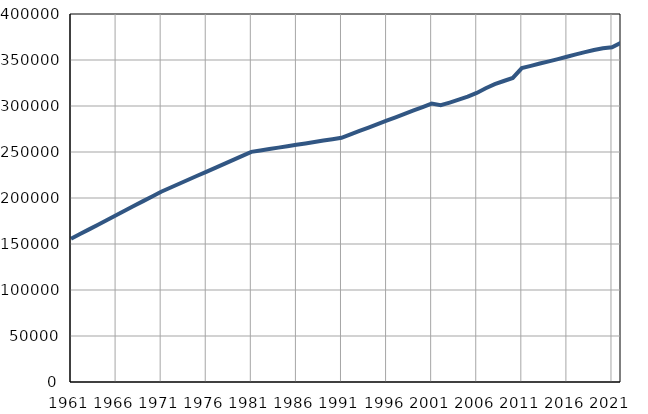
| Category | Population
size |
|---|---|
| 1961.0 | 155685 |
| 1962.0 | 160799 |
| 1963.0 | 165912 |
| 1964.0 | 171026 |
| 1965.0 | 176139 |
| 1966.0 | 181252 |
| 1967.0 | 186367 |
| 1968.0 | 191480 |
| 1969.0 | 196594 |
| 1970.0 | 201708 |
| 1971.0 | 206821 |
| 1972.0 | 211153 |
| 1973.0 | 215484 |
| 1974.0 | 219816 |
| 1975.0 | 224147 |
| 1976.0 | 228480 |
| 1977.0 | 232811 |
| 1978.0 | 237143 |
| 1979.0 | 241475 |
| 1980.0 | 245806 |
| 1981.0 | 250138 |
| 1982.0 | 251671 |
| 1983.0 | 253204 |
| 1984.0 | 254736 |
| 1985.0 | 256268 |
| 1986.0 | 257801 |
| 1987.0 | 259334 |
| 1988.0 | 260866 |
| 1989.0 | 262399 |
| 1990.0 | 263931 |
| 1991.0 | 265464 |
| 1992.0 | 269177 |
| 1993.0 | 272890 |
| 1994.0 | 276602 |
| 1995.0 | 280315 |
| 1996.0 | 284029 |
| 1997.0 | 287741 |
| 1998.0 | 291455 |
| 1999.0 | 295167 |
| 2000.0 | 298880 |
| 2001.0 | 302593 |
| 2002.0 | 300831 |
| 2003.0 | 303745 |
| 2004.0 | 306853 |
| 2005.0 | 310185 |
| 2006.0 | 314192 |
| 2007.0 | 319259 |
| 2008.0 | 323708 |
| 2009.0 | 327175 |
| 2010.0 | 330527 |
| 2011.0 | 341228 |
| 2012.0 | 343648 |
| 2013.0 | 346163 |
| 2014.0 | 348540 |
| 2015.0 | 350930 |
| 2016.0 | 353525 |
| 2017.0 | 356126 |
| 2018.0 | 358572 |
| 2019.0 | 360925 |
| 2020.0 | 362675 |
| 2021.0 | 363789 |
| 2022.0 | 368743 |